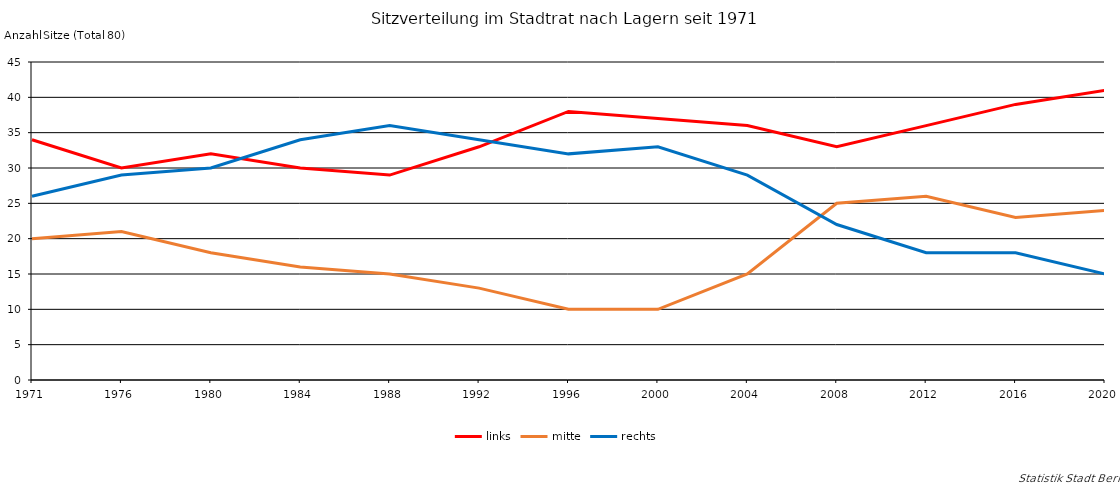
| Category | links | mitte | rechts |
|---|---|---|---|
| 1971.0 | 34 | 20 | 26 |
| 1976.0 | 30 | 21 | 29 |
| 1980.0 | 32 | 18 | 30 |
| 1984.0 | 30 | 16 | 34 |
| 1988.0 | 29 | 15 | 36 |
| 1992.0 | 33 | 13 | 34 |
| 1996.0 | 38 | 10 | 32 |
| 2000.0 | 37 | 10 | 33 |
| 2004.0 | 36 | 15 | 29 |
| 2008.0 | 33 | 25 | 22 |
| 2012.0 | 36 | 26 | 18 |
| 2016.0 | 39 | 23 | 18 |
| 2020.0 | 41 | 24 | 15 |